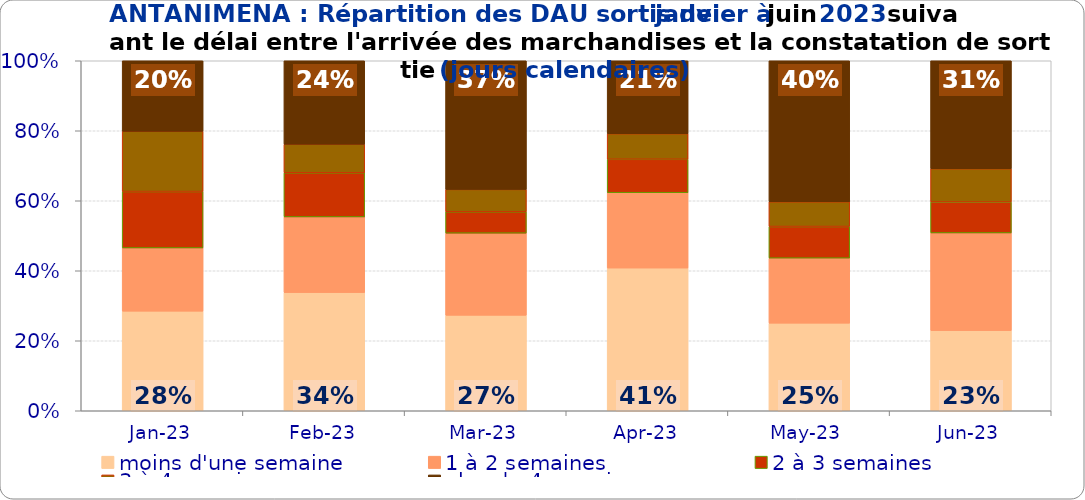
| Category | moins d'une semaine | 1 à 2 semaines | 2 à 3 semaines | 3 à 4 semaines | plus de 4 semaines |
|---|---|---|---|---|---|
| 2023-01-01 | 0.285 | 0.181 | 0.161 | 0.172 | 0.201 |
| 2023-02-01 | 0.338 | 0.216 | 0.126 | 0.082 | 0.238 |
| 2023-03-01 | 0.273 | 0.235 | 0.061 | 0.064 | 0.368 |
| 2023-04-01 | 0.408 | 0.215 | 0.096 | 0.073 | 0.208 |
| 2023-05-01 | 0.25 | 0.186 | 0.09 | 0.071 | 0.403 |
| 2023-06-01 | 0.229 | 0.279 | 0.088 | 0.095 | 0.308 |